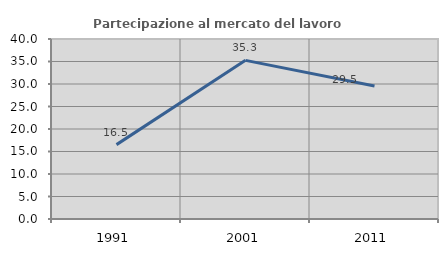
| Category | Partecipazione al mercato del lavoro  femminile |
|---|---|
| 1991.0 | 16.529 |
| 2001.0 | 35.252 |
| 2011.0 | 29.545 |